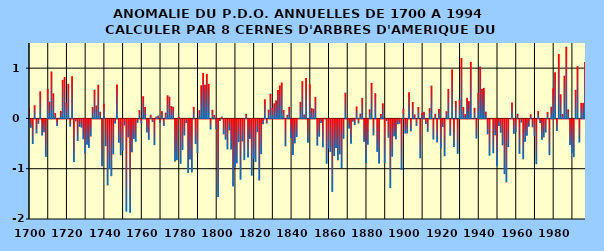
| Category | PDO |
|---|---|
| 1700.0 | 0.215 |
| 1701.0 | -0.167 |
| 1702.0 | -0.488 |
| 1703.0 | 0.261 |
| 1704.0 | -0.277 |
| 1705.0 | -0.088 |
| 1706.0 | 0.539 |
| 1707.0 | -0.32 |
| 1708.0 | -0.254 |
| 1709.0 | -0.745 |
| 1710.0 | 0.591 |
| 1711.0 | 0.336 |
| 1712.0 | 0.934 |
| 1713.0 | 0.5 |
| 1714.0 | 0.107 |
| 1715.0 | -0.13 |
| 1716.0 | 0.014 |
| 1717.0 | 0.15 |
| 1718.0 | 0.769 |
| 1719.0 | 0.824 |
| 1720.0 | 0.305 |
| 1721.0 | 0.69 |
| 1722.0 | -0.142 |
| 1723.0 | 0.838 |
| 1724.0 | -0.849 |
| 1725.0 | -0.038 |
| 1726.0 | -0.428 |
| 1727.0 | -0.148 |
| 1728.0 | -0.163 |
| 1729.0 | -0.394 |
| 1730.0 | -0.676 |
| 1731.0 | -0.505 |
| 1732.0 | -0.566 |
| 1733.0 | -0.339 |
| 1734.0 | 0.225 |
| 1735.0 | 0.574 |
| 1736.0 | 0.258 |
| 1737.0 | 0.671 |
| 1738.0 | 0.134 |
| 1739.0 | -0.933 |
| 1740.0 | 0.292 |
| 1741.0 | -0.532 |
| 1742.0 | -1.311 |
| 1743.0 | -0.988 |
| 1744.0 | -1.128 |
| 1745.0 | -0.696 |
| 1746.0 | -0.082 |
| 1747.0 | 0.676 |
| 1748.0 | -0.464 |
| 1749.0 | -0.715 |
| 1750.0 | -0.626 |
| 1751.0 | -0.121 |
| 1752.0 | -1.836 |
| 1753.0 | -0.358 |
| 1754.0 | -1.858 |
| 1755.0 | -0.651 |
| 1756.0 | -0.388 |
| 1757.0 | -0.443 |
| 1758.0 | -0.068 |
| 1759.0 | 0.166 |
| 1760.0 | -0.078 |
| 1761.0 | 0.442 |
| 1762.0 | 0.227 |
| 1763.0 | -0.261 |
| 1764.0 | -0.406 |
| 1765.0 | 0.074 |
| 1766.0 | -0.053 |
| 1767.0 | -0.511 |
| 1768.0 | 0.038 |
| 1769.0 | 0.058 |
| 1770.0 | -0.07 |
| 1771.0 | 0.144 |
| 1772.0 | -0.13 |
| 1773.0 | 0.116 |
| 1774.0 | 0.461 |
| 1775.0 | 0.434 |
| 1776.0 | 0.247 |
| 1777.0 | 0.232 |
| 1778.0 | -0.836 |
| 1779.0 | -0.811 |
| 1780.0 | 0.034 |
| 1781.0 | -0.883 |
| 1782.0 | -0.609 |
| 1783.0 | -0.32 |
| 1784.0 | -0.072 |
| 1785.0 | -1.062 |
| 1786.0 | -0.799 |
| 1787.0 | -1.054 |
| 1788.0 | 0.229 |
| 1789.0 | -0.49 |
| 1790.0 | -0.674 |
| 1791.0 | 0.162 |
| 1792.0 | 0.659 |
| 1793.0 | 0.903 |
| 1794.0 | 0.669 |
| 1795.0 | 0.886 |
| 1796.0 | 0.69 |
| 1797.0 | -0.201 |
| 1798.0 | 0.173 |
| 1799.0 | 0.071 |
| 1800.0 | -0.189 |
| 1801.0 | -1.544 |
| 1802.0 | -0.034 |
| 1803.0 | 0.038 |
| 1804.0 | -0.298 |
| 1805.0 | -0.403 |
| 1806.0 | -0.595 |
| 1807.0 | -0.219 |
| 1808.0 | -0.599 |
| 1809.0 | -1.336 |
| 1810.0 | -0.949 |
| 1811.0 | -0.874 |
| 1812.0 | -0.45 |
| 1813.0 | -1.2 |
| 1814.0 | -0.437 |
| 1815.0 | -0.809 |
| 1816.0 | 0.093 |
| 1817.0 | -0.757 |
| 1818.0 | -0.387 |
| 1819.0 | -1.119 |
| 1820.0 | -0.783 |
| 1821.0 | -0.845 |
| 1822.0 | -0.256 |
| 1823.0 | -1.214 |
| 1824.0 | -0.691 |
| 1825.0 | -0.094 |
| 1826.0 | 0.381 |
| 1827.0 | -0.081 |
| 1828.0 | 0.175 |
| 1829.0 | 0.494 |
| 1830.0 | 0.212 |
| 1831.0 | 0.301 |
| 1832.0 | 0.359 |
| 1833.0 | 0.566 |
| 1834.0 | 0.655 |
| 1835.0 | 0.715 |
| 1836.0 | 0.166 |
| 1837.0 | -0.535 |
| 1838.0 | 0.074 |
| 1839.0 | 0.232 |
| 1840.0 | -0.372 |
| 1841.0 | -0.71 |
| 1842.0 | -0.475 |
| 1843.0 | -0.352 |
| 1844.0 | 0.01 |
| 1845.0 | 0.33 |
| 1846.0 | 0.741 |
| 1847.0 | 0.079 |
| 1848.0 | 0.806 |
| 1849.0 | -0.462 |
| 1850.0 | 0.679 |
| 1851.0 | 0.205 |
| 1852.0 | 0.193 |
| 1853.0 | 0.427 |
| 1854.0 | -0.522 |
| 1855.0 | -0.345 |
| 1856.0 | -0.073 |
| 1857.0 | -0.554 |
| 1858.0 | -0.003 |
| 1859.0 | -0.881 |
| 1860.0 | -0.578 |
| 1861.0 | -0.647 |
| 1862.0 | -1.442 |
| 1863.0 | -0.727 |
| 1864.0 | -0.57 |
| 1865.0 | -0.813 |
| 1866.0 | -0.694 |
| 1867.0 | -0.966 |
| 1868.0 | -0.386 |
| 1869.0 | 0.514 |
| 1870.0 | 0.006 |
| 1871.0 | -0.182 |
| 1872.0 | -0.484 |
| 1873.0 | -0.045 |
| 1874.0 | -0.112 |
| 1875.0 | 0.238 |
| 1876.0 | -0.078 |
| 1877.0 | 0.097 |
| 1878.0 | 0.41 |
| 1879.0 | -0.446 |
| 1880.0 | -0.871 |
| 1881.0 | -0.502 |
| 1882.0 | 0.182 |
| 1883.0 | 0.708 |
| 1884.0 | -0.318 |
| 1885.0 | 0.502 |
| 1886.0 | -0.646 |
| 1887.0 | -0.878 |
| 1888.0 | 0.087 |
| 1889.0 | 0.301 |
| 1890.0 | -0.873 |
| 1891.0 | -0.033 |
| 1892.0 | -0.364 |
| 1893.0 | -1.367 |
| 1894.0 | -0.742 |
| 1895.0 | -0.332 |
| 1896.0 | -0.395 |
| 1897.0 | -0.097 |
| 1898.0 | -0.087 |
| 1899.0 | -1.004 |
| 1900.0 | 0.195 |
| 1901.0 | -0.281 |
| 1902.0 | -0.279 |
| 1903.0 | 0.521 |
| 1904.0 | -0.237 |
| 1905.0 | 0.326 |
| 1906.0 | 0.08 |
| 1907.0 | -0.129 |
| 1908.0 | 0.226 |
| 1909.0 | -0.773 |
| 1910.0 | 0.108 |
| 1911.0 | 0.134 |
| 1912.0 | -0.09 |
| 1913.0 | -0.246 |
| 1914.0 | 0.205 |
| 1915.0 | 0.654 |
| 1916.0 | -0.401 |
| 1917.0 | 0.094 |
| 1918.0 | -0.457 |
| 1919.0 | 0.187 |
| 1920.0 | -0.578 |
| 1921.0 | -0.152 |
| 1922.0 | -0.732 |
| 1923.0 | 0.143 |
| 1924.0 | 0.588 |
| 1925.0 | -0.325 |
| 1926.0 | 0.974 |
| 1927.0 | -0.547 |
| 1928.0 | 0.346 |
| 1929.0 | -0.686 |
| 1930.0 | 0.376 |
| 1931.0 | 1.202 |
| 1932.0 | 0.23 |
| 1933.0 | 0.086 |
| 1934.0 | 0.412 |
| 1935.0 | 0.342 |
| 1936.0 | 1.122 |
| 1937.0 | 0.001 |
| 1938.0 | 0.212 |
| 1939.0 | -0.382 |
| 1940.0 | 0.507 |
| 1941.0 | 1.032 |
| 1942.0 | 0.589 |
| 1943.0 | 0.607 |
| 1944.0 | 0.136 |
| 1945.0 | -0.299 |
| 1946.0 | -0.721 |
| 1947.0 | 0.004 |
| 1948.0 | -0.672 |
| 1949.0 | -0.316 |
| 1950.0 | -0.919 |
| 1951.0 | -0.131 |
| 1952.0 | -0.265 |
| 1953.0 | -0.514 |
| 1954.0 | -1.087 |
| 1955.0 | -1.253 |
| 1956.0 | -0.551 |
| 1957.0 | 0.002 |
| 1958.0 | 0.319 |
| 1959.0 | -0.286 |
| 1960.0 | -0.248 |
| 1961.0 | 0.094 |
| 1962.0 | -0.685 |
| 1963.0 | -0.063 |
| 1964.0 | -0.792 |
| 1965.0 | -0.446 |
| 1966.0 | -0.327 |
| 1967.0 | -0.145 |
| 1968.0 | 0.082 |
| 1969.0 | -0.157 |
| 1970.0 | -0.333 |
| 1971.0 | -0.89 |
| 1972.0 | 0.146 |
| 1973.0 | -0.071 |
| 1974.0 | -0.405 |
| 1975.0 | -0.357 |
| 1976.0 | -0.261 |
| 1977.0 | 0.126 |
| 1978.0 | -0.71 |
| 1979.0 | 0.233 |
| 1980.0 | 0.6 |
| 1981.0 | 0.92 |
| 1982.0 | -0.23 |
| 1983.0 | 1.28 |
| 1984.0 | 0.48 |
| 1985.0 | 0.09 |
| 1986.0 | 0.85 |
| 1987.0 | 1.43 |
| 1988.0 | 0.18 |
| 1989.0 | -0.51 |
| 1990.0 | -0.67 |
| 1991.0 | -0.75 |
| 1992.0 | 0.57 |
| 1993.0 | 1.04 |
| 1994.0 | -0.46 |
| 1995.0 | 0.31 |
| 1996.0 | 0.31 |
| 1997.0 | 1.12 |